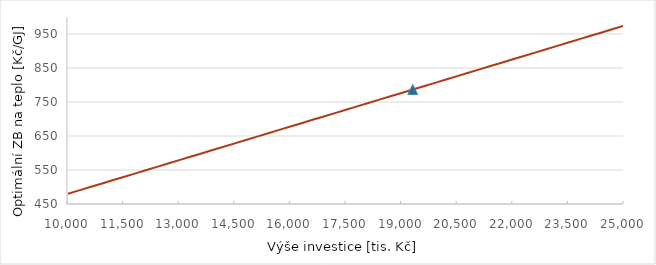
| Category | Series 0 |
|---|---|
| 10000.0 | 480.099 |
| 10300.0 | 489.986 |
| 10600.0 | 499.872 |
| 10900.0 | 509.758 |
| 11200.0 | 519.645 |
| 11500.0 | 529.531 |
| 11800.0 | 539.417 |
| 12100.0 | 549.304 |
| 12400.0 | 559.19 |
| 12700.0 | 569.077 |
| 13000.0 | 578.963 |
| 13300.0 | 588.849 |
| 13600.0 | 598.736 |
| 13900.0 | 608.622 |
| 14200.0 | 618.508 |
| 14500.0 | 628.395 |
| 14800.0 | 638.281 |
| 15100.0 | 648.167 |
| 15400.0 | 658.054 |
| 15700.0 | 667.94 |
| 16000.0 | 677.826 |
| 16300.0 | 687.713 |
| 16600.0 | 697.599 |
| 16900.0 | 707.486 |
| 17200.0 | 717.372 |
| 17500.0 | 727.258 |
| 17800.0 | 737.145 |
| 18100.0 | 747.031 |
| 18400.0 | 756.917 |
| 18700.0 | 766.804 |
| 19000.0 | 776.69 |
| 19300.0 | 786.576 |
| 19600.0 | 796.463 |
| 19900.0 | 806.349 |
| 20200.0 | 816.235 |
| 20500.0 | 826.122 |
| 20800.0 | 836.008 |
| 21100.0 | 845.895 |
| 21400.0 | 855.781 |
| 21700.0 | 865.667 |
| 22000.0 | 875.554 |
| 22300.0 | 885.44 |
| 22600.0 | 895.326 |
| 22900.0 | 905.213 |
| 23200.0 | 915.099 |
| 23500.0 | 924.985 |
| 23800.0 | 934.872 |
| 24100.0 | 944.758 |
| 24400.0 | 954.644 |
| 24700.0 | 964.531 |
| 25000.0 | 974.417 |